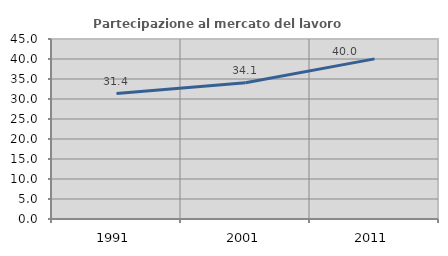
| Category | Partecipazione al mercato del lavoro  femminile |
|---|---|
| 1991.0 | 31.351 |
| 2001.0 | 34.059 |
| 2011.0 | 40.025 |